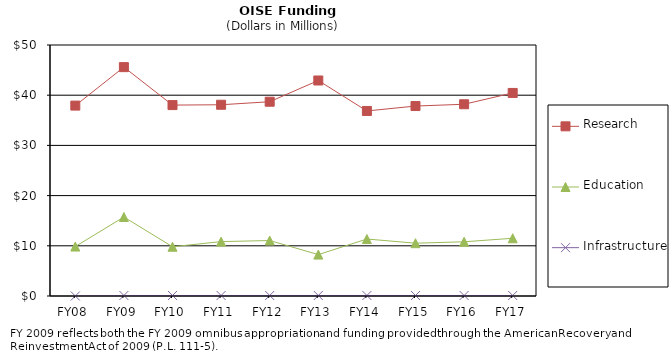
| Category | Research | Education | Infrastructure |
|---|---|---|---|
| FY08 | 37.93 | 9.85 | 0 |
| FY09 | 45.59 | 15.74 | 0.1 |
| FY10 | 38.03 | 9.81 | 0.1 |
| FY11 | 38.095 | 10.836 | 0.1 |
| FY12 | 38.7 | 11.05 | 0.1 |
| FY13 | 42.93 | 8.25 | 0.1 |
| FY14 | 36.86 | 11.35 | 0.1 |
| FY15 | 37.84 | 10.52 | 0.1 |
| FY16 | 38.197 | 10.8 | 0.1 |
| FY17 | 40.45 | 11.5 | 0.1 |